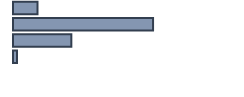
| Category | Series 0 |
|---|---|
| 0 | 10.8 |
| 1 | 61.7 |
| 2 | 25.7 |
| 3 | 1.8 |
| 4 | 0 |